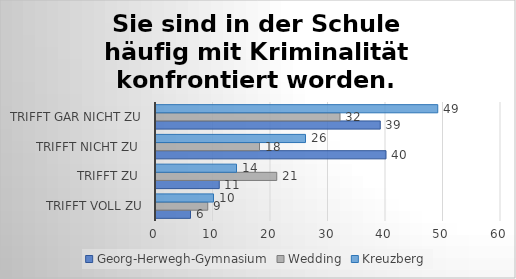
| Category | Georg-Herwegh-Gymnasium | Wedding | Kreuzberg |
|---|---|---|---|
| trifft voll zu | 6 | 9 | 10 |
| trifft zu  | 11 | 21 | 14 |
| trifft nicht zu  | 40 | 18 | 26 |
| trifft gar nicht zu | 39 | 32 | 49 |